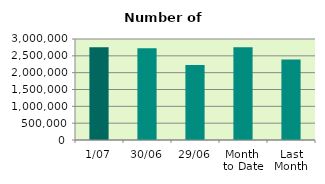
| Category | Series 0 |
|---|---|
| 1/07 | 2756068 |
| 30/06 | 2727516 |
| 29/06 | 2231146 |
| Month 
to Date | 2756068 |
| Last
Month | 2394428.455 |